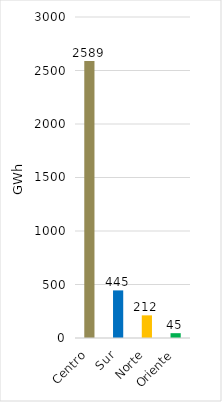
| Category | Series 0 |
|---|---|
| Centro | 2589.36 |
| Sur | 444.808 |
| Norte | 211.68 |
| Oriente | 45.058 |